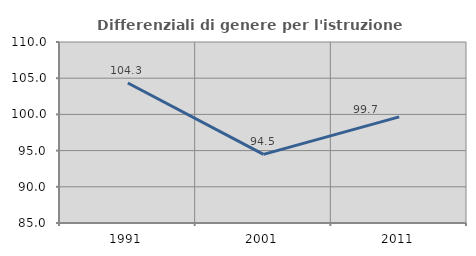
| Category | Differenziali di genere per l'istruzione superiore |
|---|---|
| 1991.0 | 104.334 |
| 2001.0 | 94.472 |
| 2011.0 | 99.659 |